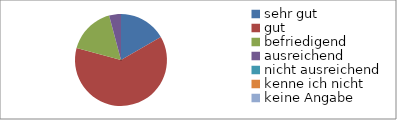
| Category | Series 0 |
|---|---|
| sehr gut | 4 |
| gut | 15 |
| befriedigend | 4 |
| ausreichend | 1 |
| nicht ausreichend | 0 |
| kenne ich nicht | 0 |
| keine Angabe | 0 |